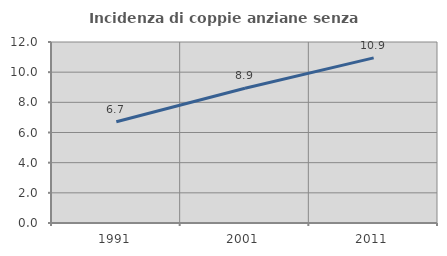
| Category | Incidenza di coppie anziane senza figli  |
|---|---|
| 1991.0 | 6.711 |
| 2001.0 | 8.939 |
| 2011.0 | 10.945 |